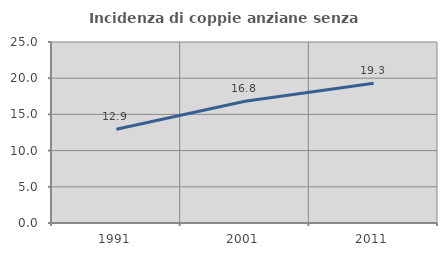
| Category | Incidenza di coppie anziane senza figli  |
|---|---|
| 1991.0 | 12.945 |
| 2001.0 | 16.809 |
| 2011.0 | 19.306 |